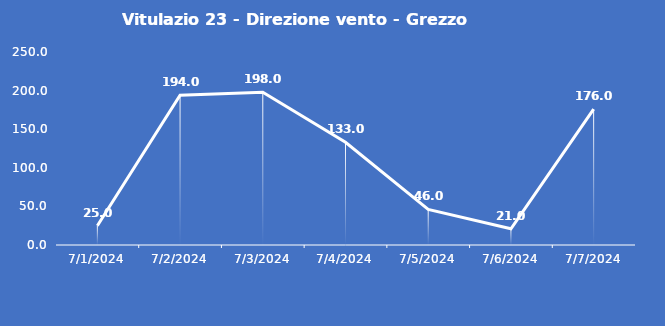
| Category | Vitulazio 23 - Direzione vento - Grezzo (°N) |
|---|---|
| 7/1/24 | 25 |
| 7/2/24 | 194 |
| 7/3/24 | 198 |
| 7/4/24 | 133 |
| 7/5/24 | 46 |
| 7/6/24 | 21 |
| 7/7/24 | 176 |